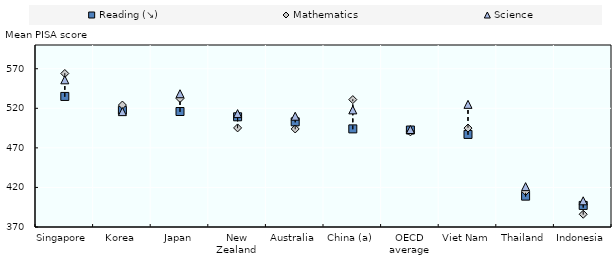
| Category | Reading (↘) | Mathematics | Science |
|---|---|---|---|
| Singapore | 535 | 564 | 556 |
| Korea | 517.437 | 524.106 | 515.81 |
| Japan | 515.958 | 532.44 | 538.395 |
| New Zealand | 509.271 | 495.223 | 513.304 |
| Australia | 502.901 | 493.896 | 509.994 |
| China (a) | 494 | 531 | 518 |
| OECD average | 492.549 | 490.204 | 493.202 |
| Viet Nam | 487 | 495 | 525 |
| Thailand | 409 | 415 | 421 |
| Indonesia | 397.259 | 386.11 | 403.1 |